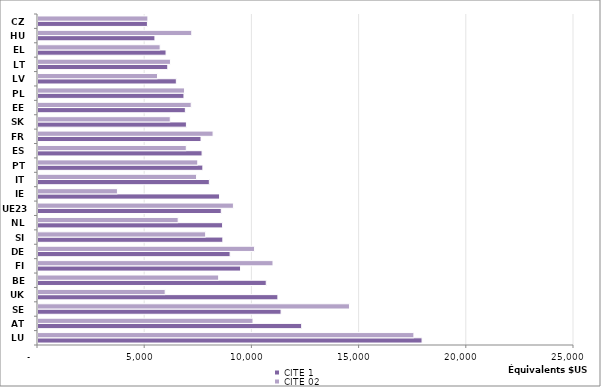
| Category | CITE 1 | CITE 02 |
|---|---|---|
| LU | 17912.871 | 17532.783 |
| AT | 12298.601 | 10027.569 |
| SE | 11337.568 | 14527.564 |
| UK | 11188.209 | 5932.256 |
| BE | 10645.753 | 8426.605 |
| FI | 9447.325 | 10960.583 |
| DE | 8959.843 | 10101.296 |
| SI | 8621.391 | 7819.411 |
| NL | 8609.413 | 6537.771 |
| UE23 | 8548.359 | 9114.164 |
| IE | 8468.464 | 3704.844 |
| IT | 7991.184 | 7395.042 |
| PT | 7689.084 | 7451.271 |
| ES | 7652.695 | 6916.246 |
| FR | 7603.363 | 8165.296 |
| SK | 6922.28 | 6168.73 |
| EE | 6872.483 | 7145.794 |
| PL | 6808.124 | 6831.997 |
| LV | 6452.501 | 5573.591 |
| LT | 6052.524 | 6178.283 |
| EL | 5972.516 | 5697.038 |
| HU | 5453.677 | 7171.213 |
| CZ | 5104.023 | 5125.073 |